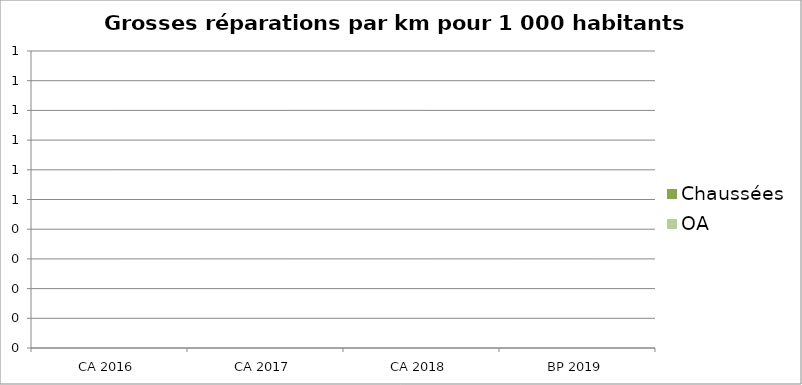
| Category | Chaussées | OA |
|---|---|---|
| CA 2016 | 0 | 0 |
| CA 2017 | 0 | 0 |
| CA 2018 | 0 | 0 |
| BP 2019 | 0 | 0 |